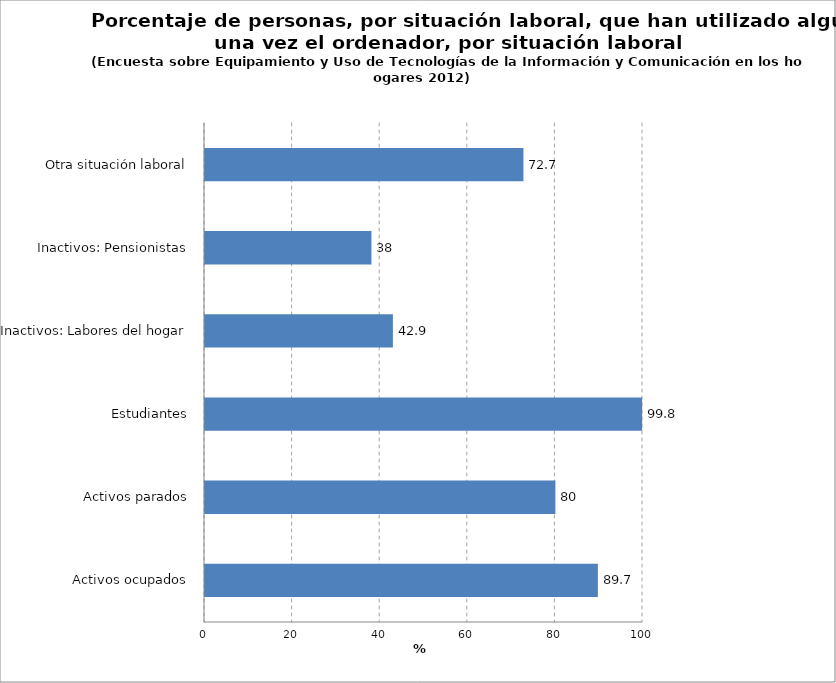
| Category | % |
|---|---|
| Activos ocupados | 89.7 |
| Activos parados | 80 |
|  Estudiantes | 99.8 |
| Inactivos: Labores del hogar | 42.9 |
|  Inactivos: Pensionistas | 38 |
|  Otra situación laboral | 72.7 |